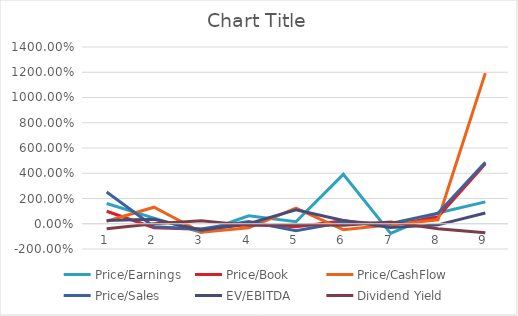
| Category | Price/Earnings | Price/Book | Price/CashFlow | Price/Sales | EV/EBITDA | Dividend Yield |
|---|---|---|---|---|---|---|
| 0 | 1.606 | 0.988 | 0.202 | 2.513 | 0.267 | -0.396 |
| 1 | 0.447 | -0.318 | 1.311 | -0.242 | 0.36 | -0.005 |
| 2 | -0.684 | -0.427 | -0.672 | -0.419 | -0.52 | 0.246 |
| 3 | 0.627 | -0.068 | -0.325 | 0.179 | 0.011 | -0.128 |
| 4 | 0.157 | -0.231 | 1.236 | -0.557 | 1.112 | -0.079 |
| 5 | 3.911 | 0.237 | -0.467 | 0.112 | 0.261 | -0.116 |
| 6 | -0.759 | -0.117 | -0.082 | 0.029 | -0.298 | 0.136 |
| 7 | 0.848 | 0.543 | 0.314 | 0.833 | -0.089 | -0.399 |
| 8 | 1.73 | 4.75 | 11.933 | 4.87 | 0.852 | -0.721 |